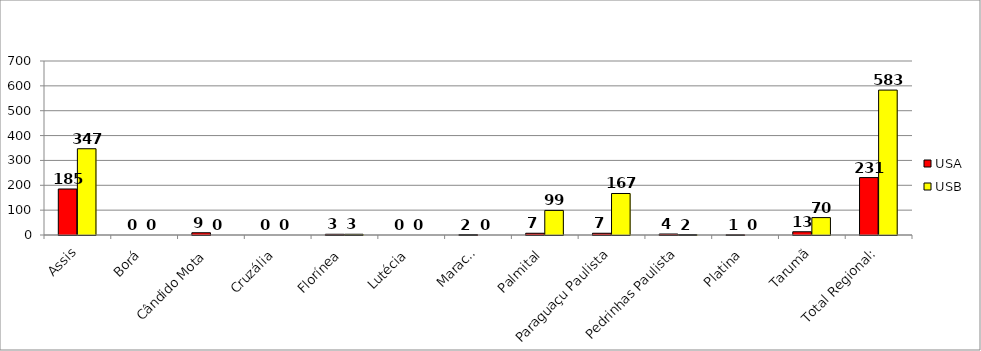
| Category | USA | USB |
|---|---|---|
| Assis | 185 | 347 |
| Borá | 0 | 0 |
| Cândido Mota | 9 | 0 |
| Cruzália | 0 | 0 |
| Florínea | 3 | 3 |
| Lutécia | 0 | 0 |
| Maracaí | 2 | 0 |
| Palmital | 7 | 99 |
| Paraguaçu Paulista | 7 | 167 |
| Pedrinhas Paulista | 4 | 2 |
| Platina | 1 | 0 |
| Tarumã | 13 | 70 |
| Total Regional: | 231 | 583 |